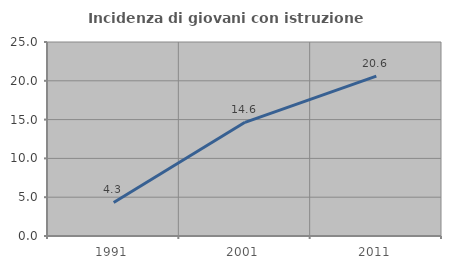
| Category | Incidenza di giovani con istruzione universitaria |
|---|---|
| 1991.0 | 4.329 |
| 2001.0 | 14.646 |
| 2011.0 | 20.606 |